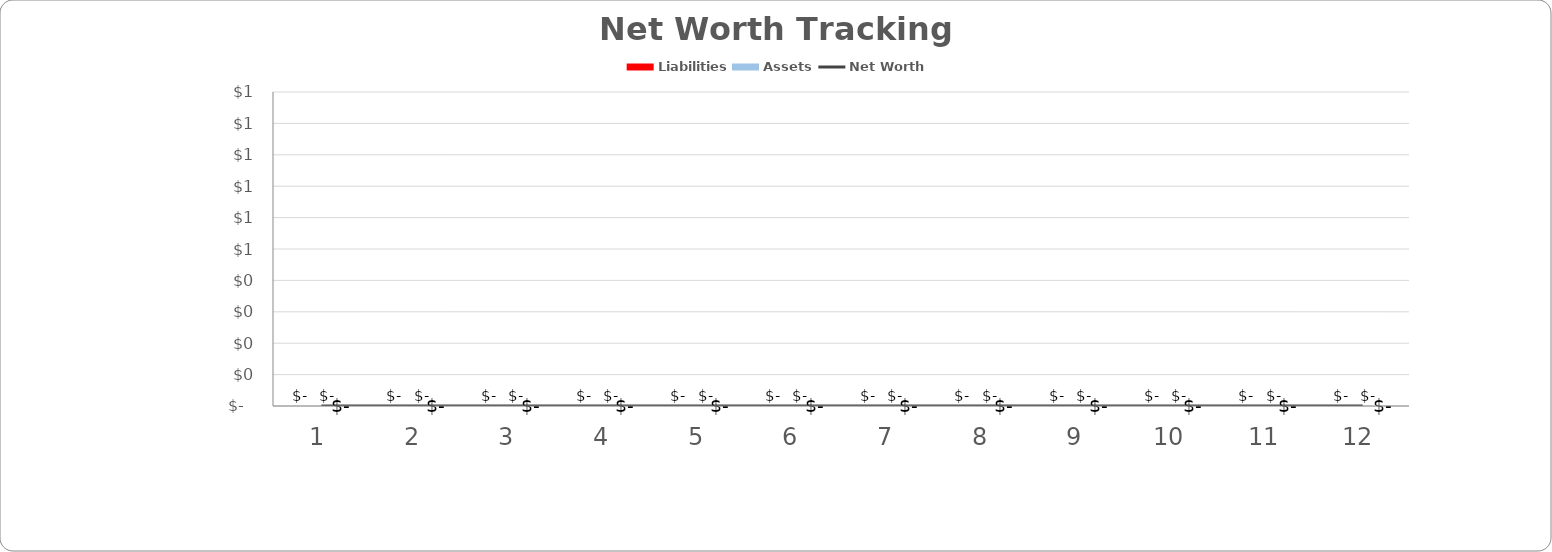
| Category | Liabilities | Assets |
|---|---|---|
| 0 | 0 | 0 |
| 1 | 0 | 0 |
| 2 | 0 | 0 |
| 3 | 0 | 0 |
| 4 | 0 | 0 |
| 5 | 0 | 0 |
| 6 | 0 | 0 |
| 7 | 0 | 0 |
| 8 | 0 | 0 |
| 9 | 0 | 0 |
| 10 | 0 | 0 |
| 11 | 0 | 0 |